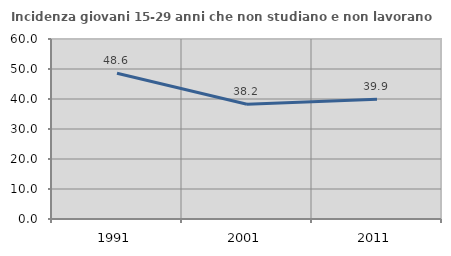
| Category | Incidenza giovani 15-29 anni che non studiano e non lavorano  |
|---|---|
| 1991.0 | 48.61 |
| 2001.0 | 38.23 |
| 2011.0 | 39.907 |